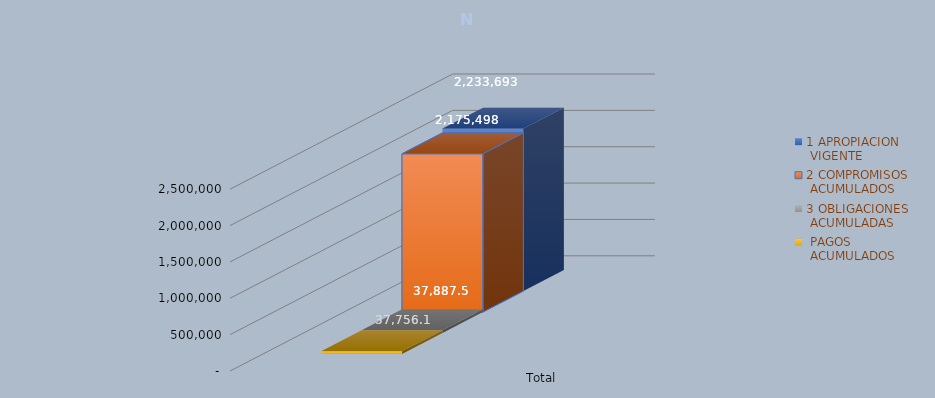
| Category | 1 APROPIACION
 VIGENTE | 2 COMPROMISOS
 ACUMULADOS | 3 OBLIGACIONES
 ACUMULADAS |  PAGOS
 ACUMULADOS |
|---|---|---|---|---|
| Total | 2233693.029 | 2175497.976 | 37887.542 | 37756.137 |